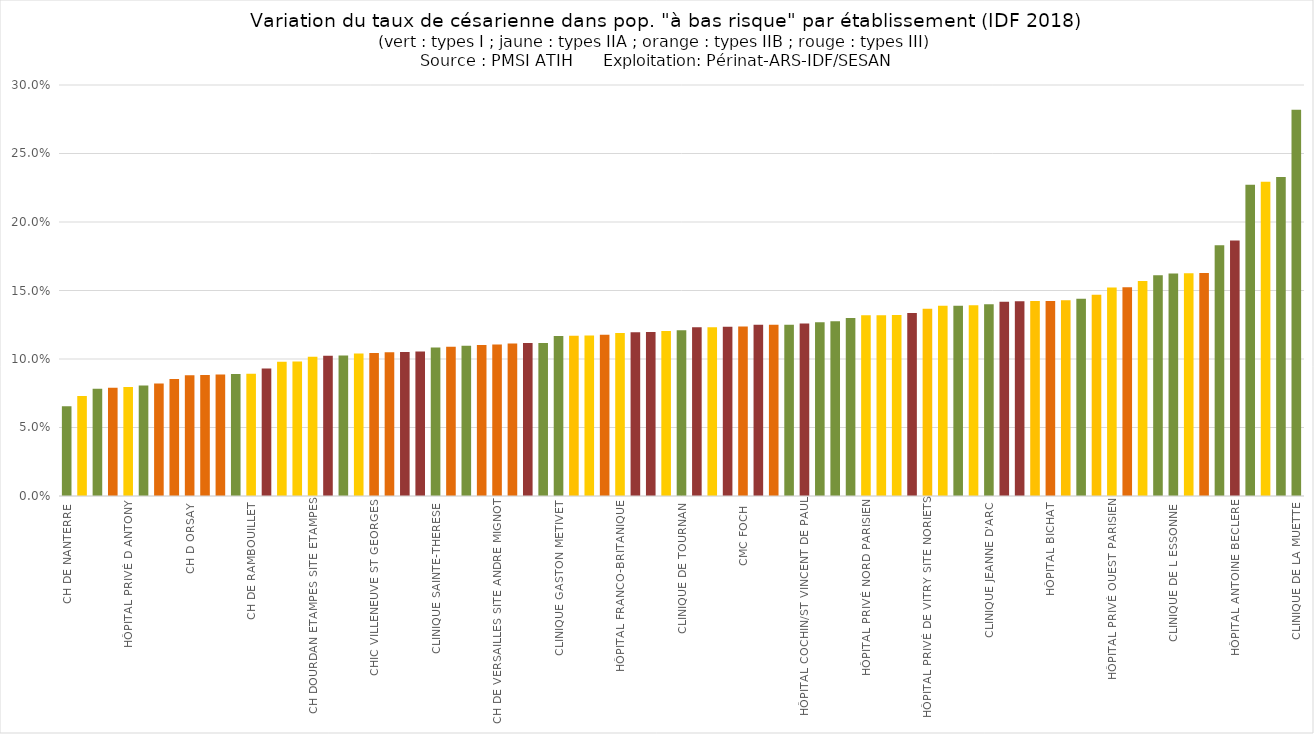
| Category | Series 0 |
|---|---|
| CH DE NANTERRE | 0.065 |
| GH CARNELLE PORTES OISE  | 0.073 |
| CLINIQUE DE L'YVETTE | 0.078 |
| CH DE FONTAINEBLEAU | 0.079 |
| HÔPITAL PRIVÉ D ANTONY | 0.079 |
| MATERNITE DES LILAS | 0.081 |
| CH RIVES DE SEINE SITE NEUILLY S/SEINE | 0.082 |
| GH SAINT-JOSEPH | 0.085 |
| CH D ORSAY | 0.088 |
| GHI LE RAINCY MONTFERMEIL | 0.088 |
| GHEM SIMONE VEIL | 0.089 |
| HÔPITAL LES BLUETS | 0.089 |
| CH DE RAMBOUILLET | 0.089 |
| HÔPITAL LOUIS MOURIER | 0.093 |
| CH DE PROVINS | 0.098 |
| CH DE COULOMMIERS | 0.098 |
| CH DOURDAN ETAMPES SITE ETAMPES | 0.102 |
| CHIC ANDRE GREGOIRE | 0.102 |
| CLINIQUE CONTI | 0.102 |
| HÔPITAL LARIBOISIERE | 0.104 |
| CHIC VILLENEUVE ST GEORGES | 0.104 |
| CH DE MELUN | 0.105 |
| CH RENE DUBOS | 0.105 |
| CH DE MEAUX | 0.106 |
| CLINIQUE SAINTE-THERESE | 0.108 |
| CHIC ROBERT BALLANGER | 0.109 |
| CLINIQUE DU VERT GALANT | 0.11 |
| CH GENERAL DE GONESSE | 0.11 |
| CH DE VERSAILLES SITE ANDRE MIGNOT | 0.111 |
| GHEF MARNE LA VALLEE SITE JOSSIGNY | 0.111 |
| CH SUD FRANCILIEN | 0.112 |
| CLINIQUE SAINT LOUIS | 0.112 |
| CLINIQUE GASTON METIVET | 0.117 |
| CH DES QUATRE VILLES SITE ST CLOUD | 0.117 |
| LES HÔPITAUX DE SAINT MAURICE | 0.117 |
| HÔPITAL PRIVÉ DE SEINE ST DENIS | 0.118 |
| HÔPITAL FRANCO-BRITANIQUE | 0.119 |
| HÔPITAL DE BICETRE | 0.12 |
| CH VICTOR DUPOUY | 0.12 |
| CMC PARLY II | 0.12 |
| CLINIQUE DE TOURNAN | 0.121 |
| HÔPITAL ROBERT DEBRE | 0.123 |
| HÔPITAL EUROPEEN LA ROSERAIE | 0.123 |
| CHIC DE CRETEIL | 0.123 |
| CMC FOCH | 0.124 |
| CHIC POISSY ST GERMAIN | 0.125 |
| CH FRANCOIS QUESNAY MANTES | 0.125 |
| HÔPITAL DES DIACONESSES | 0.125 |
| HÔPITAL COCHIN/ST VINCENT DE PAUL | 0.126 |
| INSTITUT MUTUALISTE MONTSOURIS | 0.127 |
| CH MONTEREAU | 0.127 |
| CHIC DE MEULAN LES MUREAUX | 0.13 |
| HÔPITAL PRIVÉ NORD PARISIEN | 0.132 |
| HÔPITAL PRIVÉ ARMAND BRILLARD | 0.132 |
| CLINIQUE DE L'ESTREE | 0.132 |
| HÔPITAL NECKER ENFANTS MALADES | 0.134 |
| HÔPITAL PRIVÉ DE VITRY SITE NORIETS | 0.137 |
| CH D ARPAJON | 0.139 |
| CLINIQUE SAINT GERMAIN | 0.139 |
| HÔPITAL TENON | 0.139 |
| CLINIQUE JEANNE D'ARC | 0.14 |
| CH DELAFONTAINE | 0.142 |
| HÔPITAL TROUSSEAU | 0.142 |
| HÔPITAL PITIE-SALPETRIERE | 0.142 |
| HÔPITAL BICHAT | 0.142 |
| CH PRIVÉ CLAUDE GALIEN | 0.143 |
| POLYCLINIQUE VAUBAN | 0.144 |
| HÔPITAL PRIVÉ DE MARNE-LA-VALLÉE | 0.147 |
| HÔPITAL PRIVÉ OUEST PARISIEN | 0.152 |
| CH DES DEUX VALLEES SITE LONGJUMEAU | 0.152 |
| MATERNITE SAINTE FELICITE | 0.157 |
| HÔPITAL BEAUJON | 0.161 |
| CLINIQUE DE L ESSONNE | 0.162 |
| CLINIQUE CLAUDE BERNARD | 0.163 |
| HÔPITAL JEAN VERDIER | 0.163 |
| CMC EVRY | 0.183 |
| HÔPITAL ANTOINE BECLERE | 0.187 |
| HÔPITAL AMERICAIN | 0.227 |
| CLINIQUE DES FRANCISCAINES | 0.229 |
| CLINIQUE LAMBERT | 0.233 |
| CLINIQUE DE LA MUETTE | 0.282 |